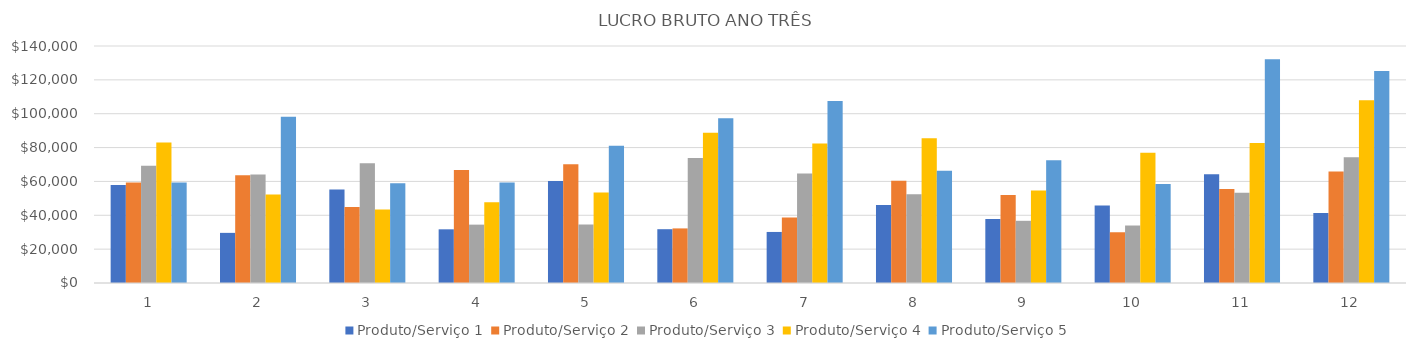
| Category | Produto/Serviço 1 | Produto/Serviço 2 | Produto/Serviço 3 | Produto/Serviço 4 | Produto/Serviço 5 |
|---|---|---|---|---|---|
| 0 | 57836.6 | 59440 | 69246 | 82984 | 59413.5 |
| 1 | 29614.1 | 63648 | 64143 | 52347.6 | 98185.5 |
| 2 | 55166.4 | 44895 | 70812 | 43367.7 | 58932.5 |
| 3 | 31708.8 | 66690.6 | 34479 | 47752.2 | 59427.5 |
| 4 | 60206.4 | 70077.2 | 34560 | 53457.6 | 81075 |
| 5 | 31779.6 | 32250.6 | 73809 | 88777.8 | 97290 |
| 6 | 30153.7 | 38663 | 64629 | 82350.9 | 107459.5 |
| 7 | 46071.9 | 60368.4 | 52452 | 85547.7 | 66308.5 |
| 8 | 37793.3 | 52053.6 | 36738 | 54600.9 | 72485.5 |
| 9 | 45727.2 | 29979.2 | 33957 | 76889.7 | 58522 |
| 10 | 64291.5 | 55457.4 | 53364 | 82752.7 | 132151.5 |
| 11 | 41314 | 65830.8 | 74340 | 108009.5 | 125209.5 |